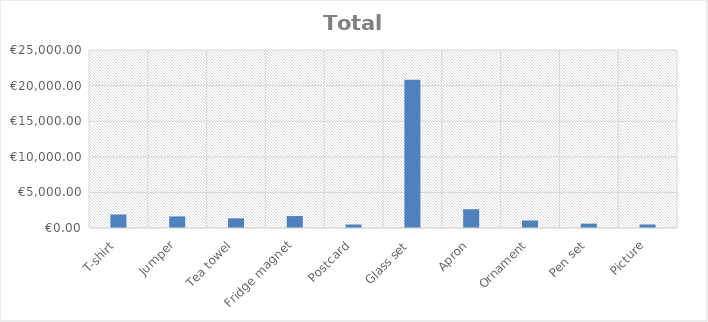
| Category | Series 0 |
|---|---|
| T-shirt | 1896.77 |
| Jumper | 1628.11 |
| Tea towel | 1357.94 |
| Fridge magnet | 1678.137 |
| Postcard | 485.925 |
| Glass set | 20806.083 |
| Apron | 2633.02 |
| Ornament | 1052.296 |
| Pen set | 607.648 |
| Picture | 496.736 |